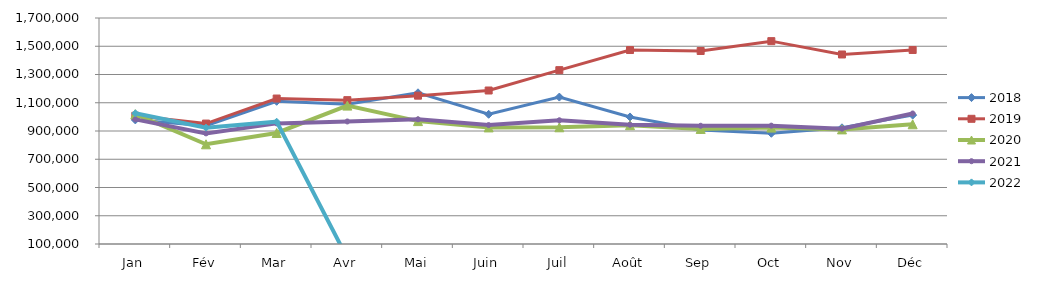
| Category | 2018 | 2019 | 2020 | 2021 | 2022 |
|---|---|---|---|---|---|
| Jan | 978468.279 | 1007982.373 | 1019103.465 | 982555.093 | 1025150.28 |
| Fév | 937137.209 | 952616.766 | 805837.355 | 883272.289 | 923686.154 |
| Mar | 1110199.711 | 1129815.679 | 886115.696 | 953969.676 | 965816.099 |
| Avr | 1090229.308 | 1118398.221 | 1079723.465 | 967473.972 | 0 |
| Mai | 1170512.154 | 1150217.455 | 970040.088 | 982779.252 | 0 |
| Juin | 1018295.812 | 1186623.687 | 925406.896 | 941931.836 | 0 |
| Juil | 1140133.118 | 1330812.699 | 926286.755 | 976002.038 | 0 |
| Août | 999343.146 | 1473280.035 | 941195.84 | 944349.197 | 0 |
| Sep | 907808.882 | 1466448.158 | 914678.196 | 937034.569 | 0 |
| Oct | 883825.979 | 1536100.268 | 923984.732 | 937856.38 | 0 |
| Nov | 922678.039 | 1441770.199 | 911296.416 | 916487.725 | 0 |
| Déc | 1012620.724 | 1473565.92 | 947568.113 | 1024000.752 | 0 |